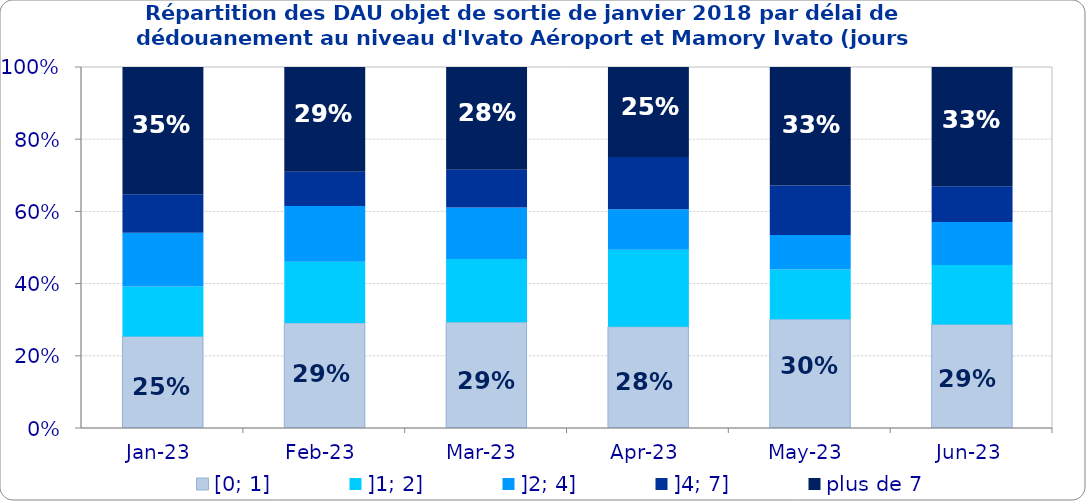
| Category | [0; 1] | ]1; 2] | ]2; 4] | ]4; 7] | plus de 7 |
|---|---|---|---|---|---|
| 2023-01-01 | 0.254 | 0.138 | 0.149 | 0.106 | 0.353 |
| 2023-02-01 | 0.291 | 0.17 | 0.155 | 0.095 | 0.29 |
| 2023-03-01 | 0.293 | 0.175 | 0.143 | 0.104 | 0.284 |
| 2023-04-01 | 0.281 | 0.213 | 0.113 | 0.145 | 0.249 |
| 2023-05-01 | 0.301 | 0.138 | 0.096 | 0.137 | 0.328 |
| 2023-06-01 | 0.287 | 0.165 | 0.119 | 0.099 | 0.33 |